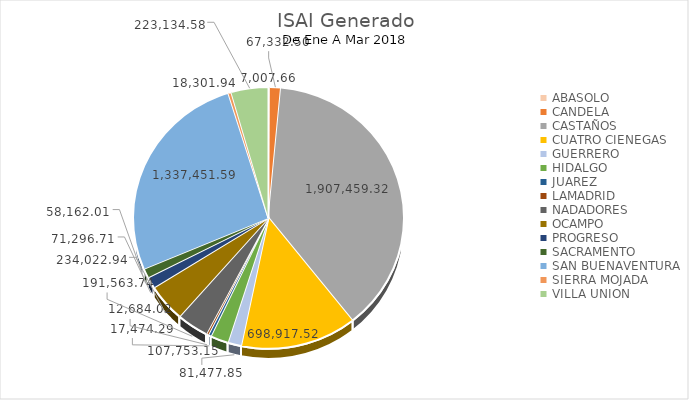
| Category | Series 0 |
|---|---|
| ABASOLO | 7007.66 |
| CANDELA | 67332.5 |
| CASTAÑOS | 1907459.32 |
| CUATRO CIENEGAS | 698917.52 |
| GUERRERO | 81477.85 |
| HIDALGO | 107753.15 |
| JUAREZ | 17474.29 |
| LAMADRID | 12684.02 |
| NADADORES | 191563.74 |
| OCAMPO | 234022.94 |
| PROGRESO | 71296.71 |
| SACRAMENTO | 58162.01 |
| SAN BUENAVENTURA | 1337451.59 |
| SIERRA MOJADA | 18301.94 |
| VILLA UNION | 223134.58 |